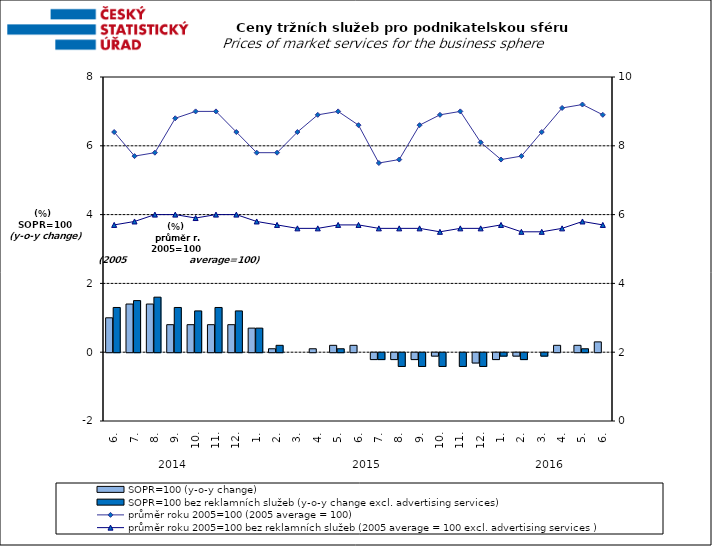
| Category | SOPR=100 (y-o-y change)   | SOPR=100 bez reklamních služeb (y-o-y change excl. advertising services)   |
|---|---|---|
| 0 | 1 | 1.3 |
| 1 | 1.4 | 1.5 |
| 2 | 1.4 | 1.6 |
| 3 | 0.8 | 1.3 |
| 4 | 0.8 | 1.2 |
| 5 | 0.8 | 1.3 |
| 6 | 0.8 | 1.2 |
| 7 | 0.7 | 0.7 |
| 8 | 0.1 | 0.2 |
| 9 | 0 | 0 |
| 10 | 0.1 | 0 |
| 11 | 0.2 | 0.1 |
| 12 | 0.2 | 0 |
| 13 | -0.2 | -0.2 |
| 14 | -0.2 | -0.4 |
| 15 | -0.2 | -0.4 |
| 16 | -0.1 | -0.4 |
| 17 | 0 | -0.4 |
| 18 | -0.3 | -0.4 |
| 19 | -0.2 | -0.1 |
| 20 | -0.1 | -0.2 |
| 21 | 0 | -0.1 |
| 22 | 0.2 | 0 |
| 23 | 0.2 | 0.1 |
| 24 | 0.3 | 0 |